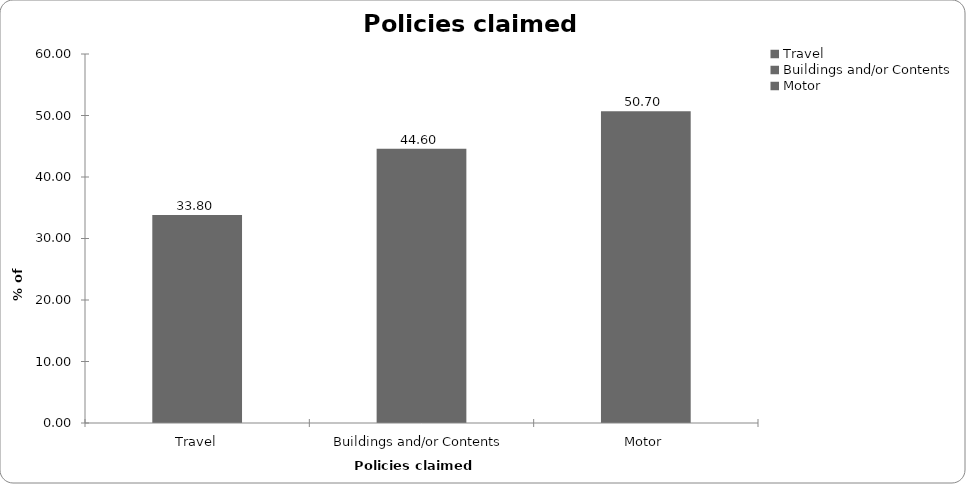
| Category | Policies claimed on |
|---|---|
| Travel | 33.803 |
| Buildings and/or Contents | 44.601 |
| Motor | 50.704 |